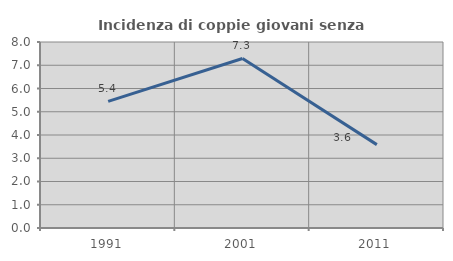
| Category | Incidenza di coppie giovani senza figli |
|---|---|
| 1991.0 | 5.444 |
| 2001.0 | 7.292 |
| 2011.0 | 3.586 |